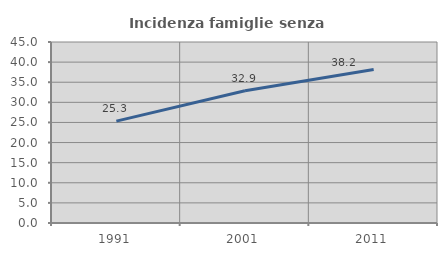
| Category | Incidenza famiglie senza nuclei |
|---|---|
| 1991.0 | 25.329 |
| 2001.0 | 32.899 |
| 2011.0 | 38.164 |